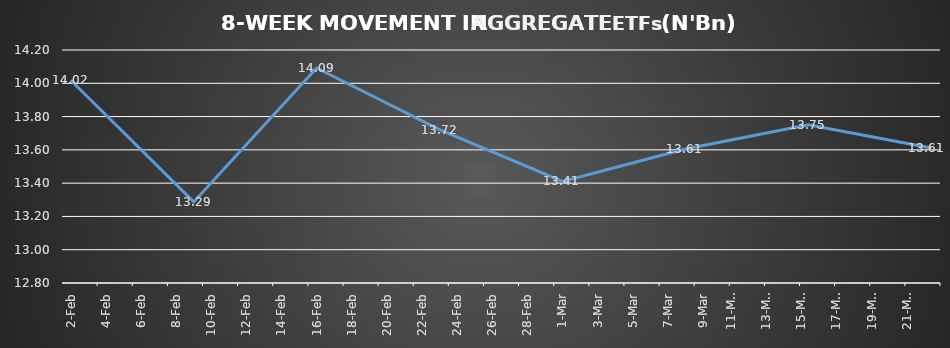
| Category | ETFs AGGREGATE |
|---|---|
| 2024-02-02 | 14.018 |
| 2024-02-09 | 13.287 |
| 2024-02-16 | 14.092 |
| 2024-02-23 | 13.721 |
| 2024-03-01 | 13.41 |
| 2024-03-08 | 13.605 |
| 2024-03-15 | 13.75 |
| 2024-03-22 | 13.612 |